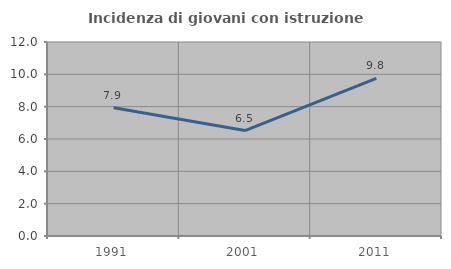
| Category | Incidenza di giovani con istruzione universitaria |
|---|---|
| 1991.0 | 7.937 |
| 2001.0 | 6.522 |
| 2011.0 | 9.756 |